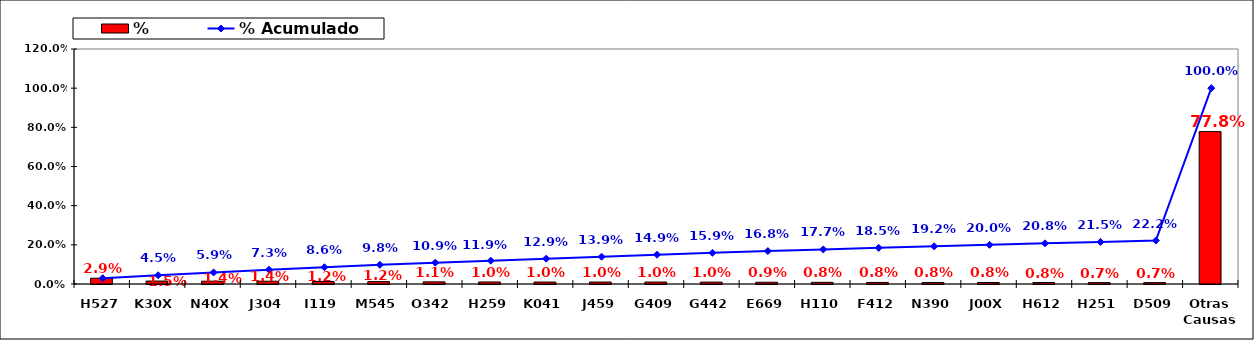
| Category | % |
|---|---|
| H527 | 0.029 |
| K30X | 0.015 |
| N40X | 0.014 |
| J304 | 0.014 |
| I119 | 0.012 |
| M545 | 0.012 |
| O342 | 0.011 |
| H259 | 0.01 |
| K041 | 0.01 |
| J459 | 0.01 |
| G409 | 0.01 |
| G442 | 0.01 |
| E669 | 0.009 |
| H110 | 0.008 |
| F412 | 0.008 |
| N390 | 0.008 |
| J00X | 0.008 |
| H612 | 0.008 |
| H251 | 0.007 |
| D509 | 0.007 |
| Otras Causas | 0.778 |